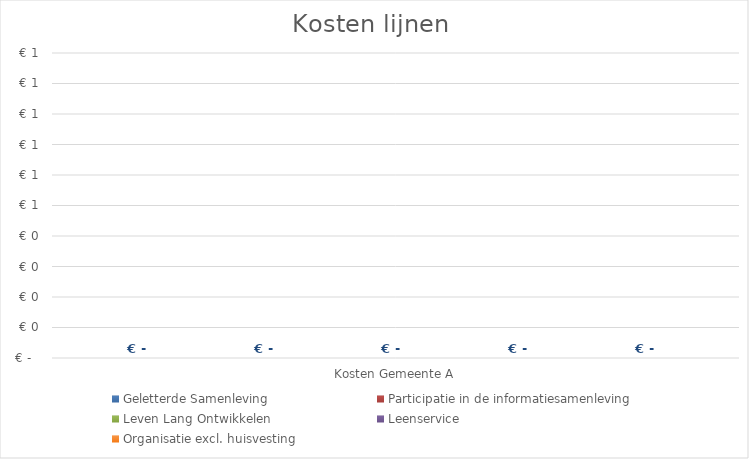
| Category | Geletterde Samenleving | Participatie in de informatiesamenleving | Leven Lang Ontwikkelen | Leenservice | Organisatie excl. huisvesting |
|---|---|---|---|---|---|
| Kosten Gemeente A | 0 | 0 | 0 | 0 | 0 |